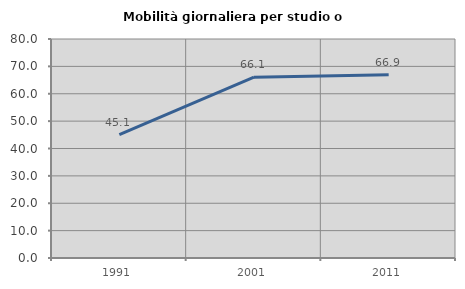
| Category | Mobilità giornaliera per studio o lavoro |
|---|---|
| 1991.0 | 45.109 |
| 2001.0 | 66.056 |
| 2011.0 | 66.916 |